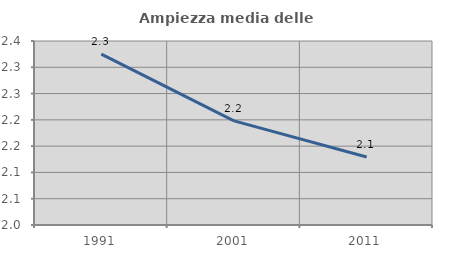
| Category | Ampiezza media delle famiglie |
|---|---|
| 1991.0 | 2.325 |
| 2001.0 | 2.198 |
| 2011.0 | 2.129 |